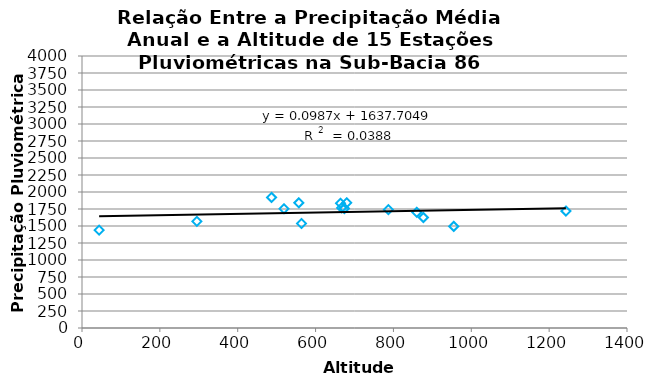
| Category | Series 0 |
|---|---|
| 44.0 | 1438.434 |
| 787.0 | 1740.913 |
| 295.0 | 1567.863 |
| 487.0 | 1919.373 |
| 674.0 | 1757.777 |
| 519.0 | 1753.503 |
| 1243.0 | 1720.02 |
| 667.0 | 1765.983 |
| 664.0 | 1835.013 |
| 564.0 | 1536.555 |
| 877.0 | 1624.835 |
| 557.0 | 1841.713 |
| 680.0 | 1842.333 |
| 860.0 | 1700.703 |
| 955.0 | 1494.74 |